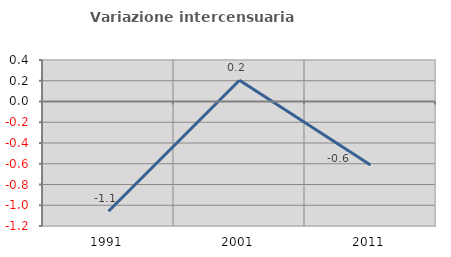
| Category | Variazione intercensuaria annua |
|---|---|
| 1991.0 | -1.058 |
| 2001.0 | 0.205 |
| 2011.0 | -0.612 |